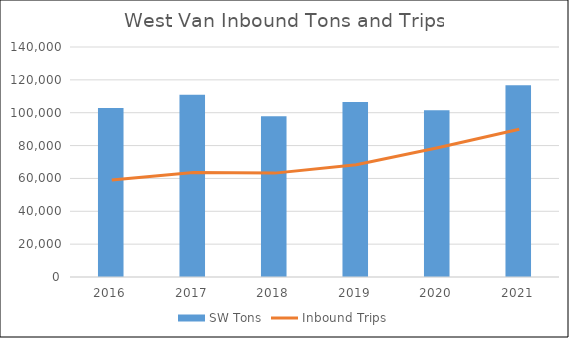
| Category | SW Tons |
|---|---|
| 2016.0 | 102798 |
| 2017.0 | 110865 |
| 2018.0 | 97792 |
| 2019.0 | 106476.41 |
| 2020.0 | 101469.95 |
| 2021.0 | 116719.15 |